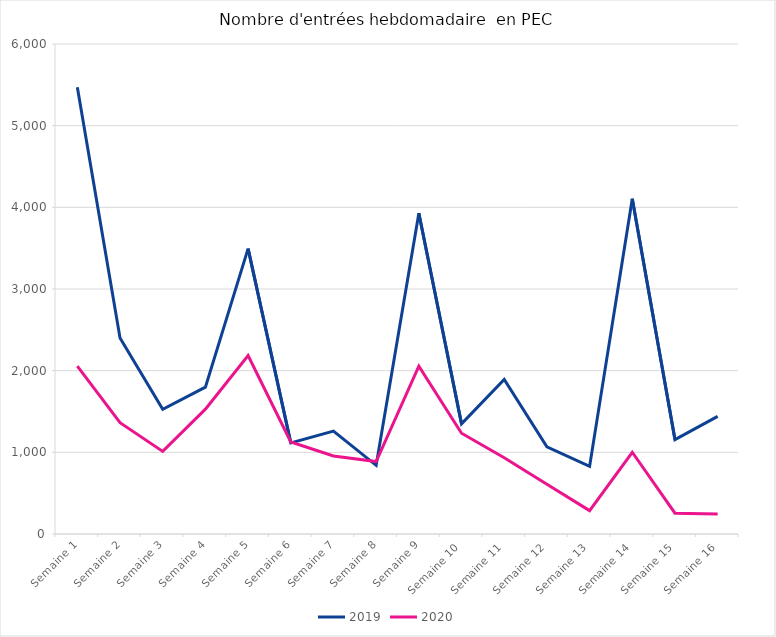
| Category | 2019 | 2020 |
|---|---|---|
| Semaine 1 | 5470 | 2056 |
| Semaine 2 | 2400 | 1362 |
| Semaine 3 | 1527 | 1011 |
| Semaine 4 | 1798 | 1529 |
| Semaine 5 | 3495 | 2184 |
| Semaine 6 | 1116 | 1127 |
| Semaine 7 | 1260 | 955 |
| Semaine 8 | 841 | 887 |
| Semaine 9 | 3928 | 2056 |
| Semaine 10 | 1349 | 1234 |
| Semaine 11 | 1893 | 934 |
| Semaine 12 | 1068 | 608 |
| Semaine 13 | 828 | 286 |
| Semaine 14 | 4105 | 1001 |
| Semaine 15 | 1156 | 255 |
| Semaine 16 | 1440 | 245 |